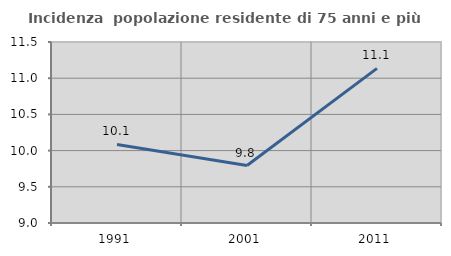
| Category | Incidenza  popolazione residente di 75 anni e più |
|---|---|
| 1991.0 | 10.085 |
| 2001.0 | 9.794 |
| 2011.0 | 11.136 |